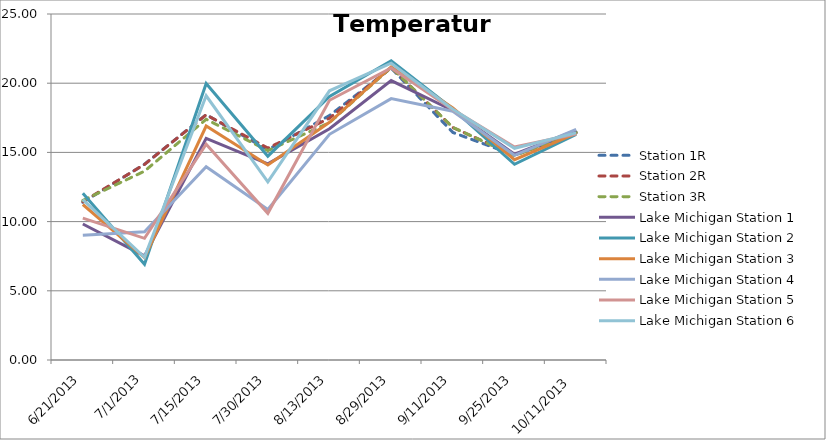
| Category | Station 1R | Station 2R | Station 3R | Lake Michigan Station 1 | Lake Michigan Station 2 | Lake Michigan Station 3 | Lake Michigan Station 4 | Lake Michigan Station 5 | Lake Michigan Station 6 |
|---|---|---|---|---|---|---|---|---|---|
| 6/21/13 | 11.392 | 11.441 | 11.529 | 9.826 | 12.05 | 11.236 | 9.011 | 10.25 | 11.59 |
| 7/1/13 | 14.145 | 14.132 | 13.643 | 7.524 | 6.914 | 7.4 | 9.26 | 8.792 | 7.414 |
| 7/15/13 | 17.725 | 17.714 | 17.392 | 16.018 | 19.981 | 16.907 | 13.959 | 15.587 | 19.092 |
| 7/30/13 | 15.19 | 15.313 | 15.129 | 14.176 | 14.726 | 14.084 | 10.87 | 10.597 | 12.866 |
| 8/13/13 | 17.665 | 17.473 | 17.153 | 16.711 | 19.04 | 17.178 | 16.306 | 18.765 | 19.451 |
| 8/29/13 | 21.091 | 21.13 | 21.141 | 20.19 | 21.623 | 21.181 | 18.886 | 21.099 | 21.443 |
| 9/11/13 | 16.441 | 16.795 | 16.809 | 18.031 | 18.137 | 18.205 | 17.979 | 18.089 | 18.12 |
| 9/25/13 | 14.798 | 14.796 | 14.762 | 14.876 | 14.143 | 14.471 | 14.792 | 15.386 | 15.296 |
| 10/11/13 | 16.418 | 16.423 | 16.459 | 16.587 | 16.303 | 16.382 | 16.658 | 16.327 | 16.411 |